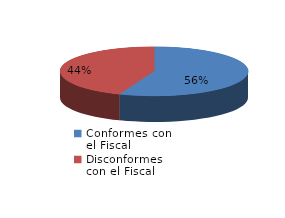
| Category | Series 0 |
|---|---|
| 0 | 33 |
| 1 | 26 |